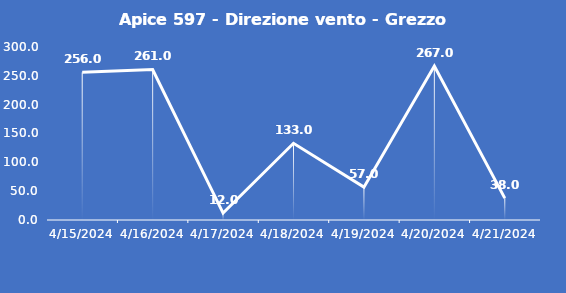
| Category | Apice 597 - Direzione vento - Grezzo (°N) |
|---|---|
| 4/15/24 | 256 |
| 4/16/24 | 261 |
| 4/17/24 | 12 |
| 4/18/24 | 133 |
| 4/19/24 | 57 |
| 4/20/24 | 267 |
| 4/21/24 | 38 |